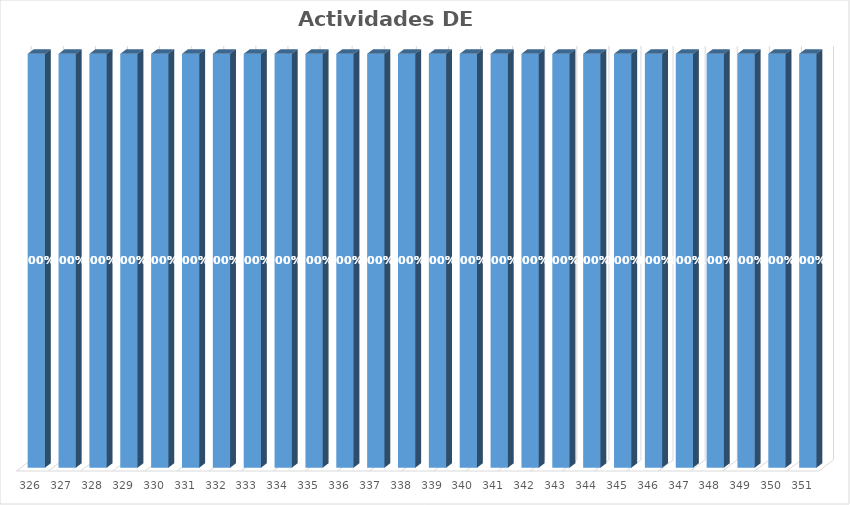
| Category | % Avance |
|---|---|
| 326.0 | 1 |
| 327.0 | 1 |
| 328.0 | 1 |
| 329.0 | 1 |
| 330.0 | 1 |
| 331.0 | 1 |
| 332.0 | 1 |
| 333.0 | 1 |
| 334.0 | 1 |
| 335.0 | 1 |
| 336.0 | 1 |
| 337.0 | 1 |
| 338.0 | 1 |
| 339.0 | 1 |
| 340.0 | 1 |
| 341.0 | 1 |
| 342.0 | 1 |
| 343.0 | 1 |
| 344.0 | 1 |
| 345.0 | 1 |
| 346.0 | 1 |
| 347.0 | 1 |
| 348.0 | 1 |
| 349.0 | 1 |
| 350.0 | 1 |
| 351.0 | 1 |